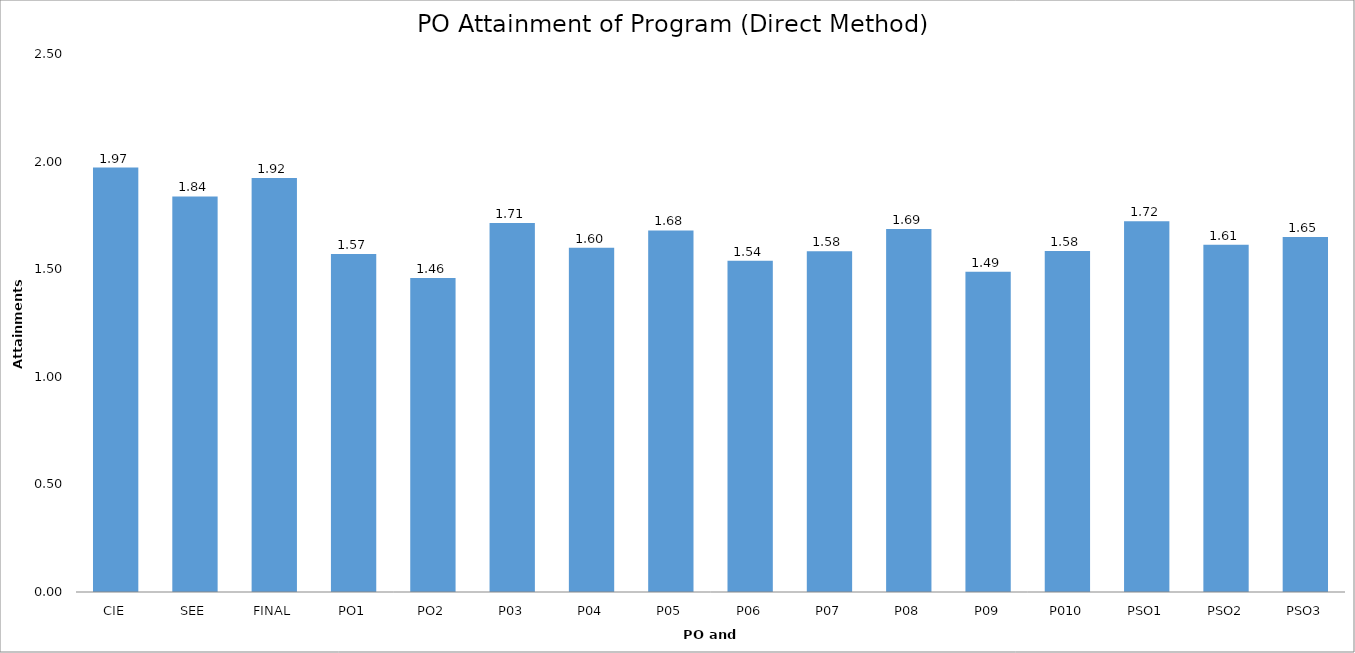
| Category | Series 0 |
|---|---|
| CIE | 1.972 |
| SEE | 1.838 |
| FINAL | 1.924 |
| PO1 | 1.571 |
| PO2 | 1.459 |
| P03 | 1.715 |
| P04 | 1.599 |
| P05 | 1.68 |
| P06 | 1.54 |
| P07 | 1.584 |
| P08 | 1.687 |
| P09 | 1.489 |
| P010 | 1.585 |
| PSO1 | 1.723 |
| PSO2 | 1.614 |
| PSO3 | 1.65 |